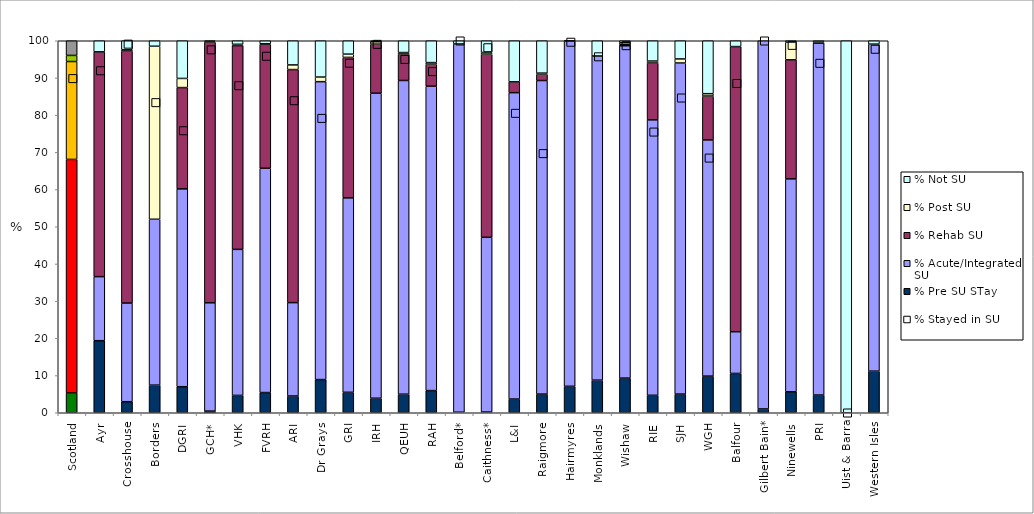
| Category | % Pre SU STay | % Acute/Integrated SU | % Rehab SU | % Post SU | % Not SU |
|---|---|---|---|---|---|
| Scotland | 5.337 | 62.765 | 26.316 | 1.639 | 3.943 |
| Ayr | 19.371 | 17.219 | 60.43 | 0 | 2.98 |
| Crosshouse | 2.97 | 26.517 | 67.764 | 0.357 | 2.39 |
| Borders | 7.424 | 44.592 | 0 | 46.513 | 1.471 |
| DGRI | 7.002 | 53.18 | 27.231 | 2.459 | 10.128 |
| GCH* | 0.445 | 29.118 | 70.08 | 0.178 | 0.178 |
| VHK | 4.663 | 39.256 | 54.777 | 0.352 | 0.952 |
| FVRH | 5.43 | 60.294 | 33.322 | 0.137 | 0.816 |
| ARI | 4.507 | 25.098 | 62.651 | 1.248 | 6.495 |
| Dr Grays | 8.92 | 80.08 | 0 | 1.24 | 9.76 |
| GRI | 5.501 | 52.266 | 37.759 | 0.875 | 3.6 |
| IRH | 3.903 | 81.997 | 13.198 | 0.629 | 0.273 |
| QEUH | 4.993 | 84.329 | 7.112 | 0.394 | 3.171 |
| RAH | 5.959 | 81.824 | 5.923 | 0.419 | 5.875 |
| Belford* | 0.145 | 98.988 | 0 | 0 | 0.867 |
| Caithness* | 0.193 | 46.976 | 49.228 | 0.45 | 3.153 |
| L&I | 3.681 | 82.362 | 2.914 | 0 | 11.043 |
| Raigmore | 5.011 | 84.295 | 1.685 | 0.308 | 8.7 |
| Hairmyres | 7.111 | 92.828 | 0 | 0 | 0.06 |
| Monklands | 8.768 | 87.116 | 0 | 0.028 | 4.088 |
| Wishaw | 9.314 | 89.344 | 0.265 | 0.53 | 0.547 |
| RIE | 4.693 | 74.046 | 15.288 | 0.513 | 5.46 |
| SJH | 5.021 | 88.998 | 0 | 1.094 | 4.888 |
| WGH | 9.846 | 63.494 | 11.801 | 0.627 | 14.232 |
| Balfour | 10.57 | 11.213 | 76.654 | 0 | 1.562 |
| Gilbert Bain* | 1.017 | 98.983 | 0 | 0 | 0 |
| Ninewells | 5.627 | 57.239 | 32.002 | 4.721 | 0.411 |
| PRI | 4.761 | 94.632 | 0.076 | 0.152 | 0.379 |
| Uist & Barra | 0 | 0 | 0 | 0 | 100 |
| Western Isles | 11.183 | 87.906 | 0 | 0 | 0.91 |